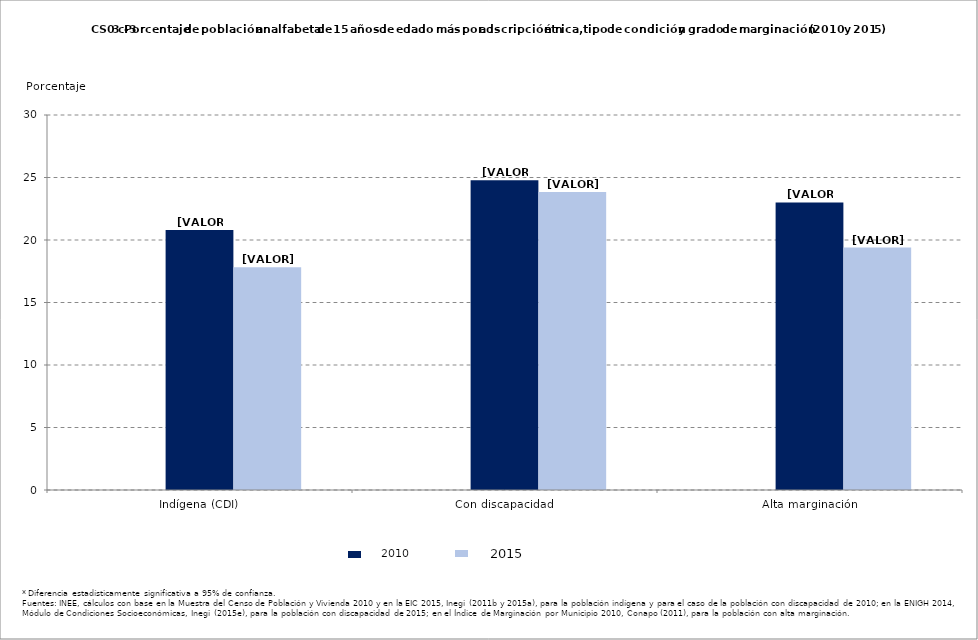
| Category | Series 0 | Series 1 | Series 2 |
|---|---|---|---|
| Indígena (CDI) |  | 20.808 | 17.818 |
| Con discapacidad |  | 24.785 | 23.849 |
| Alta marginación |  | 23.004 | 19.392 |